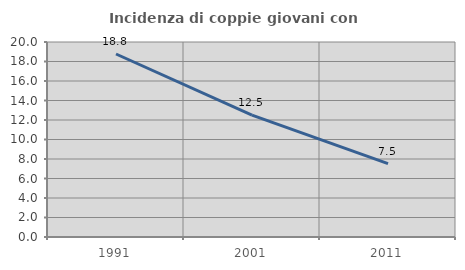
| Category | Incidenza di coppie giovani con figli |
|---|---|
| 1991.0 | 18.77 |
| 2001.0 | 12.494 |
| 2011.0 | 7.519 |